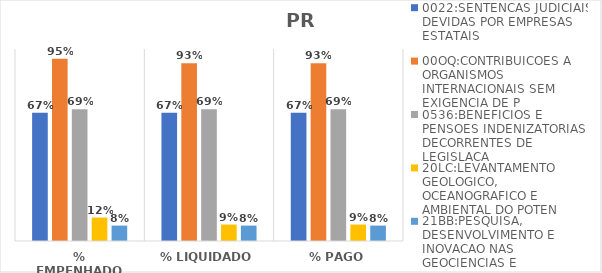
| Category | 0022:SENTENCAS JUDICIAIS DEVIDAS POR EMPRESAS ESTATAIS | 00OQ:CONTRIBUICOES A ORGANISMOS INTERNACIONAIS SEM EXIGENCIA DE P | 0536:BENEFICIOS E PENSOES INDENIZATORIAS DECORRENTES DE LEGISLACA | 20LC:LEVANTAMENTO GEOLOGICO, OCEANOGRAFICO E AMBIENTAL DO POTEN | 21BB:PESQUISA, DESENVOLVIMENTO E INOVACAO NAS GEOCIENCIAS E |
|---|---|---|---|---|---|
| % EMPENHADO | 0.668 | 0.95 | 0.687 | 0.122 | 0.08 |
| % LIQUIDADO | 0.668 | 0.926 | 0.687 | 0.086 | 0.08 |
| % PAGO | 0.668 | 0.926 | 0.687 | 0.086 | 0.08 |